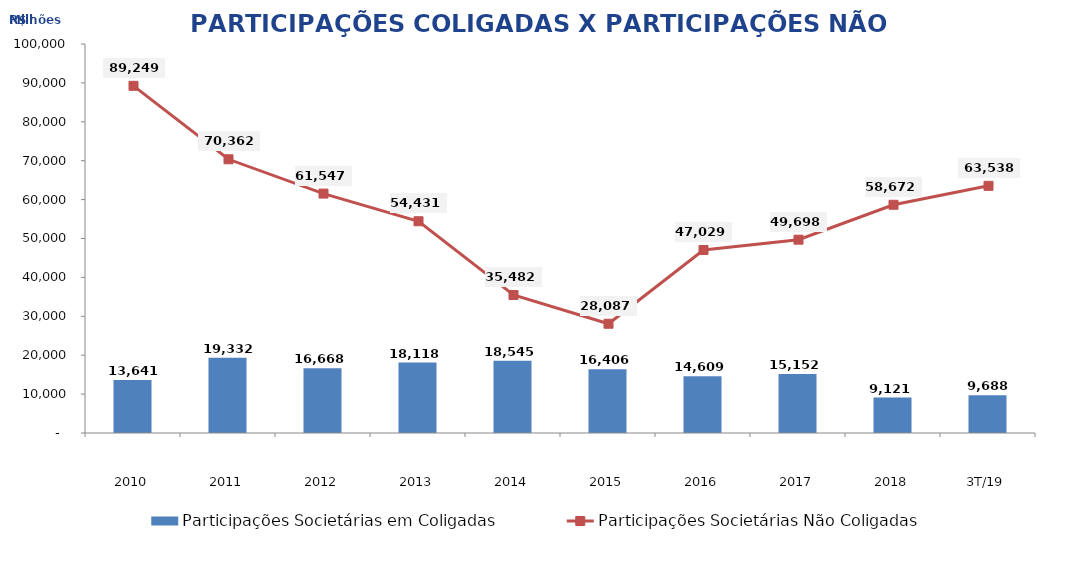
| Category | Participações Societárias em Coligadas |
|---|---|
| 2010 | 13641.374 |
| 2011 | 19332.192 |
| 2012 | 16667.573 |
| 2013 | 18118 |
| 2014 | 18544.628 |
| 2015 | 16405.548 |
| 2016 | 14609.243 |
| 2017 | 15152.49 |
| 2018 | 9121.442 |
| 3T/19 | 9687.582 |